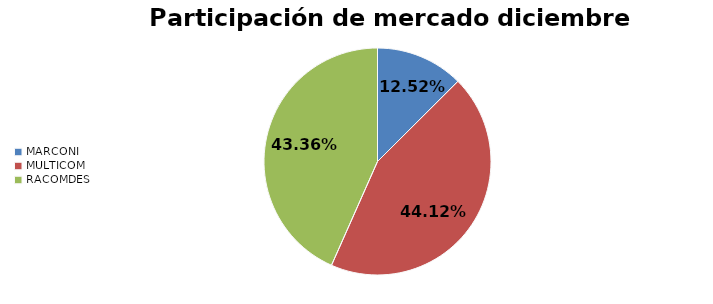
| Category | Series 0 |
|---|---|
| MARCONI | 0.125 |
| MULTICOM | 0.441 |
| RACOMDES | 0.434 |